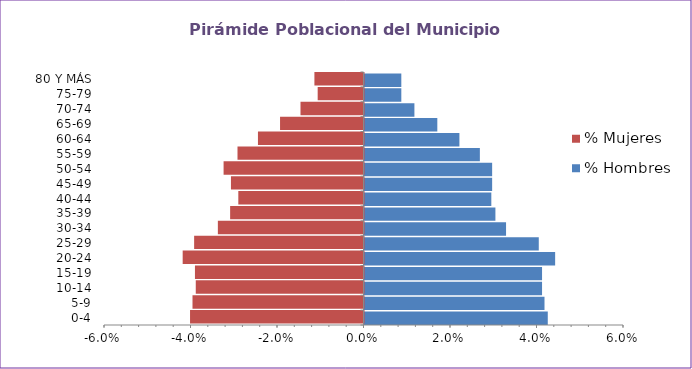
| Category | % Hombres | % Mujeres |
|---|---|---|
| 0-4 | 0.042 | -0.04 |
| 5-9 | 0.042 | -0.04 |
| 10-14 | 0.041 | -0.039 |
| 15-19 | 0.041 | -0.039 |
| 20-24 | 0.044 | -0.042 |
| 25-29 | 0.04 | -0.039 |
| 30-34 | 0.033 | -0.034 |
| 35-39 | 0.03 | -0.031 |
| 40-44 | 0.029 | -0.029 |
| 45-49 | 0.03 | -0.031 |
| 50-54 | 0.03 | -0.032 |
| 55-59 | 0.027 | -0.029 |
| 60-64 | 0.022 | -0.024 |
| 65-69 | 0.017 | -0.019 |
| 70-74 | 0.012 | -0.015 |
| 75-79 | 0.009 | -0.011 |
| 80 Y MÁS | 0.009 | -0.011 |